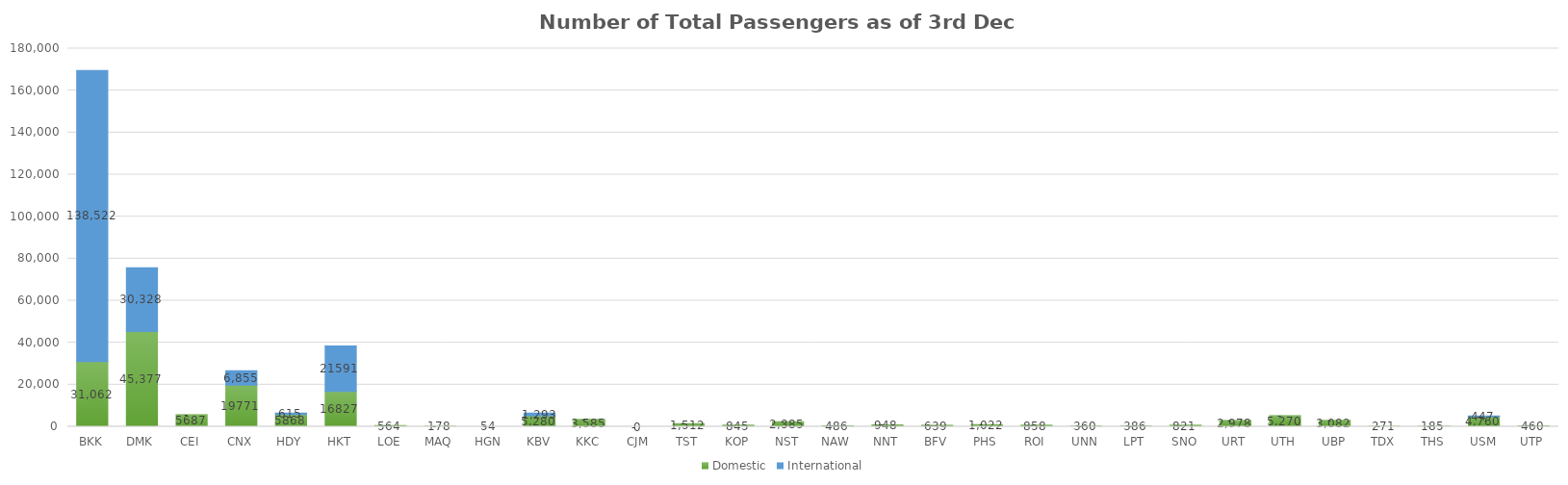
| Category | Domestic | International |
|---|---|---|
| BKK | 31062 | 138522 |
| DMK | 45377 | 30328 |
| CEI | 5687 | 0 |
| CNX | 19771 | 6855 |
| HDY | 5868 | 615 |
| HKT | 16827 | 21591 |
| LOE | 564 | 0 |
| MAQ | 178 | 0 |
| HGN | 54 | 0 |
| KBV | 5280 | 1293 |
| KKC | 3585 | 0 |
| CJM | 0 | 0 |
| TST | 1512 | 0 |
| KOP | 845 | 0 |
| NST | 2385 | 0 |
| NAW | 486 | 0 |
| NNT | 948 | 0 |
| BFV | 639 | 0 |
| PHS | 1022 | 0 |
| ROI | 858 | 0 |
| UNN | 360 | 0 |
| LPT | 386 | 0 |
| SNO | 821 | 0 |
| URT | 2978 | 0 |
| UTH | 5270 | 0 |
| UBP | 3082 | 0 |
| TDX | 271 | 0 |
| THS | 185 | 0 |
| USM | 4760 | 447 |
| UTP | 460 | 0 |